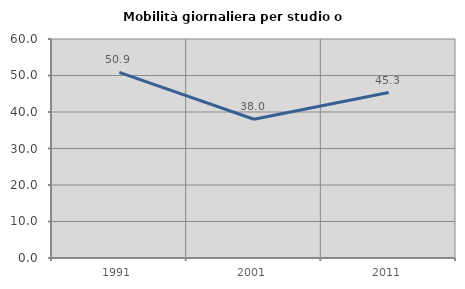
| Category | Mobilità giornaliera per studio o lavoro |
|---|---|
| 1991.0 | 50.869 |
| 2001.0 | 38.006 |
| 2011.0 | 45.323 |